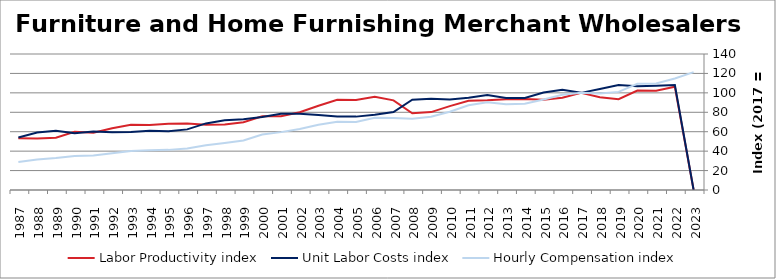
| Category | Labor Productivity index | Unit Labor Costs index | Hourly Compensation index |
|---|---|---|---|
| 2023.0 | 0 | 0 | 121.381 |
| 2022.0 | 106.264 | 108.006 | 114.771 |
| 2021.0 | 102.151 | 107.274 | 109.581 |
| 2020.0 | 102.419 | 106.758 | 109.341 |
| 2019.0 | 93.551 | 107.963 | 101 |
| 2018.0 | 95.487 | 104.063 | 99.366 |
| 2017.0 | 100 | 100 | 100 |
| 2016.0 | 95.032 | 103.249 | 98.12 |
| 2015.0 | 92.894 | 100.357 | 93.225 |
| 2014.0 | 93.712 | 94.643 | 88.692 |
| 2013.0 | 93.359 | 94.682 | 88.395 |
| 2012.0 | 92.37 | 97.67 | 90.218 |
| 2011.0 | 91.825 | 94.903 | 87.145 |
| 2010.0 | 86.343 | 93.222 | 80.491 |
| 2009.0 | 80.208 | 93.928 | 75.338 |
| 2008.0 | 78.959 | 92.885 | 73.341 |
| 2007.0 | 92.249 | 80.292 | 74.068 |
| 2006.0 | 95.98 | 77.379 | 74.268 |
| 2005.0 | 92.599 | 75.536 | 69.946 |
| 2004.0 | 92.909 | 75.737 | 70.366 |
| 2003.0 | 86.769 | 77.289 | 67.063 |
| 2002.0 | 80 | 78.593 | 62.874 |
| 2001.0 | 75.819 | 78.574 | 59.575 |
| 2000.0 | 75.928 | 75.198 | 57.096 |
| 1999.0 | 69.796 | 72.921 | 50.896 |
| 1998.0 | 67.508 | 71.69 | 48.397 |
| 1997.0 | 67.219 | 68.546 | 46.076 |
| 1996.0 | 68.431 | 62.406 | 42.705 |
| 1995.0 | 68.274 | 60.502 | 41.307 |
| 1994.0 | 67.039 | 60.983 | 40.883 |
| 1993.0 | 67.249 | 59.703 | 40.15 |
| 1992.0 | 63.66 | 59.464 | 37.855 |
| 1991.0 | 58.968 | 60.201 | 35.499 |
| 1990.0 | 60.021 | 58.421 | 35.065 |
| 1989.0 | 53.789 | 61.046 | 32.836 |
| 1988.0 | 52.982 | 59.178 | 31.354 |
| 1987.0 | 53.327 | 54.1 | 28.85 |